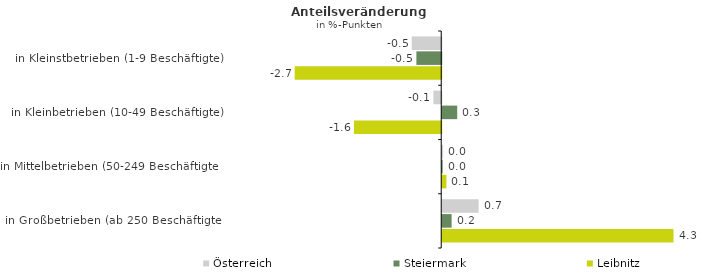
| Category | Österreich | Steiermark | Leibnitz |
|---|---|---|---|
| in Kleinstbetrieben (1-9 Beschäftigte) | -0.55 | -0.464 | -2.736 |
| in Kleinbetrieben (10-49 Beschäftigte) | -0.146 | 0.28 | -1.63 |
| in Mittelbetrieben (50-249 Beschäftigte) | 0.016 | 0.009 | 0.079 |
| in Großbetrieben (ab 250 Beschäftigte) | 0.68 | 0.175 | 4.319 |